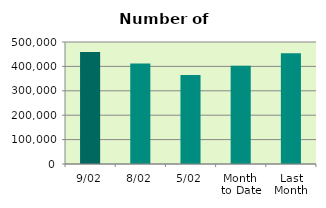
| Category | Series 0 |
|---|---|
| 9/02 | 458744 |
| 8/02 | 412230 |
| 5/02 | 364530 |
| Month 
to Date | 403174 |
| Last
Month | 453736.6 |